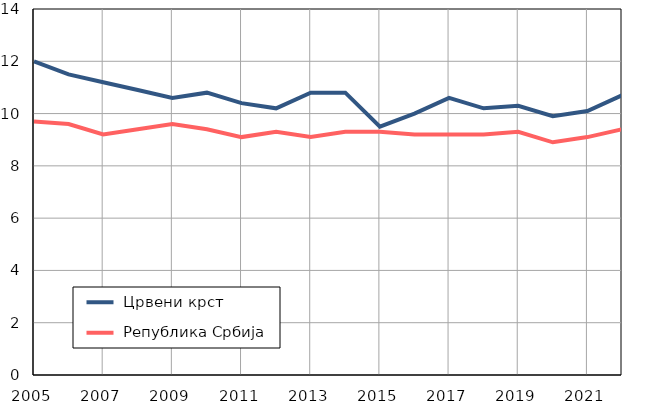
| Category |  Црвени крст |  Република Србија |
|---|---|---|
| 2005.0 | 12 | 9.7 |
| 2006.0 | 11.5 | 9.6 |
| 2007.0 | 11.2 | 9.2 |
| 2008.0 | 10.9 | 9.4 |
| 2009.0 | 10.6 | 9.6 |
| 2010.0 | 10.8 | 9.4 |
| 2011.0 | 10.4 | 9.1 |
| 2012.0 | 10.2 | 9.3 |
| 2013.0 | 10.8 | 9.1 |
| 2014.0 | 10.8 | 9.3 |
| 2015.0 | 9.5 | 9.3 |
| 2016.0 | 10 | 9.2 |
| 2017.0 | 10.6 | 9.2 |
| 2018.0 | 10.2 | 9.2 |
| 2019.0 | 10.3 | 9.3 |
| 2020.0 | 9.9 | 8.9 |
| 2021.0 | 10.1 | 9.1 |
| 2022.0 | 10.7 | 9.4 |